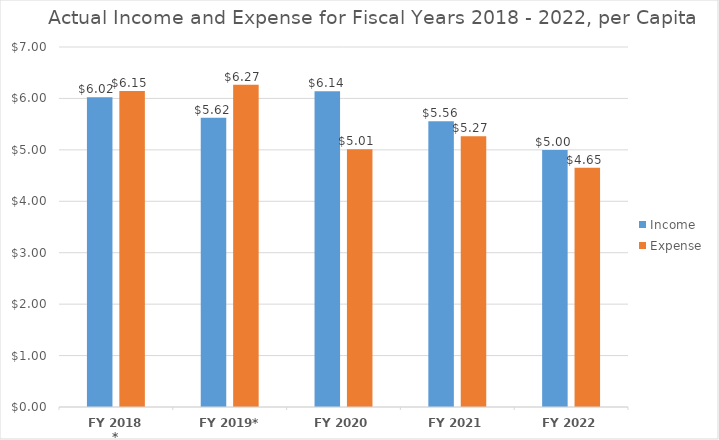
| Category | Income | Expense |
|---|---|---|
| FY 2018 * | 6.021 | 6.146 |
| FY 2019* | 5.623 | 6.265 |
| FY 2020 | 6.137 | 5.011 |
| FY 2021 | 5.558 | 5.266 |
| FY 2022 | 4.996 | 4.653 |